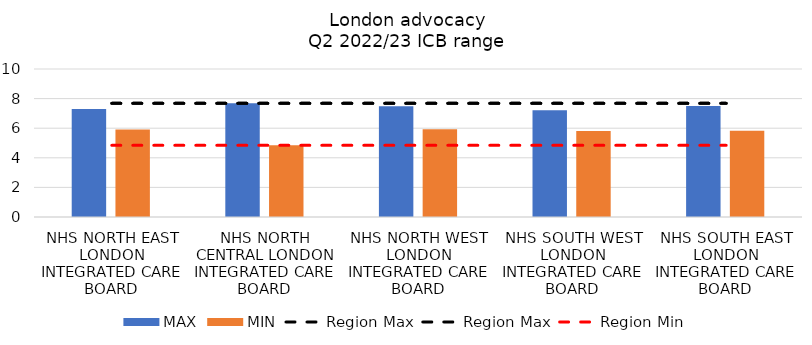
| Category | MAX | MIN |
|---|---|---|
| NHS NORTH EAST LONDON INTEGRATED CARE BOARD | 7.298 | 5.918 |
| NHS NORTH CENTRAL LONDON INTEGRATED CARE BOARD | 7.68 | 4.842 |
| NHS NORTH WEST LONDON INTEGRATED CARE BOARD | 7.477 | 5.927 |
| NHS SOUTH WEST LONDON INTEGRATED CARE BOARD | 7.214 | 5.817 |
| NHS SOUTH EAST LONDON INTEGRATED CARE BOARD | 7.496 | 5.829 |